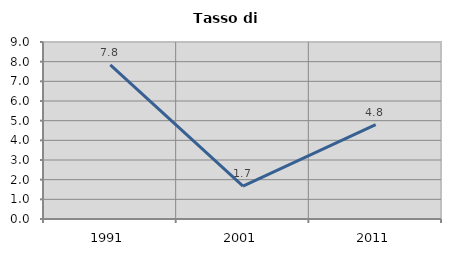
| Category | Tasso di disoccupazione   |
|---|---|
| 1991.0 | 7.834 |
| 2001.0 | 1.676 |
| 2011.0 | 4.8 |